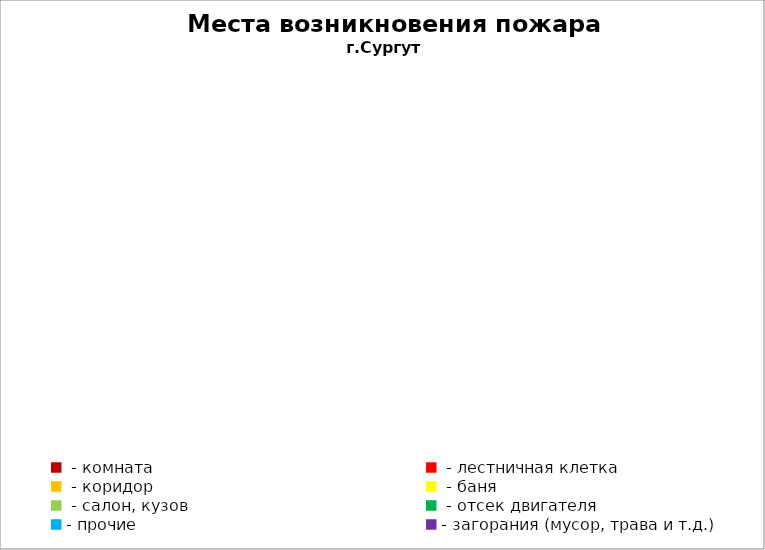
| Category | Места возникновения пожара |
|---|---|
|  - комната | 91 |
|  - лестничная клетка | 40 |
|  - коридор | 5 |
|  - баня | 65 |
|  - салон, кузов | 35 |
|  - отсек двигателя | 36 |
| - прочие | 142 |
| - загорания (мусор, трава и т.д.)  | 197 |